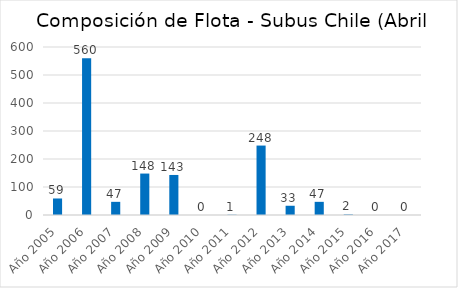
| Category | Series 0 |
|---|---|
| Año 2005 | 59 |
| Año 2006 | 560 |
| Año 2007 | 47 |
| Año 2008 | 148 |
| Año 2009 | 143 |
| Año 2010 | 0 |
| Año 2011 | 1 |
| Año 2012 | 248 |
| Año 2013 | 33 |
| Año 2014 | 47 |
| Año 2015 | 2 |
| Año 2016 | 0 |
| Año 2017 | 0 |